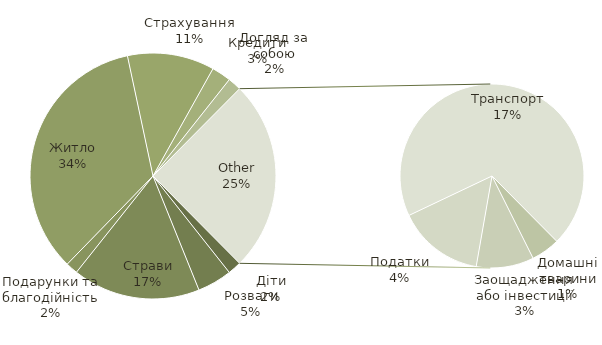
| Category | Підсумок |
|---|---|
| Діти | 140 |
| Розваги | 358 |
| Страви | 1320 |
| Подарунки та благодійність | 125 |
| Житло | 2702 |
| Страхування | 900 |
| Кредити | 200 |
| Догляд за собою | 140 |
| Домашні тварини | 100 |
| Заощадження або інвестиції | 200 |
| Податки | 300 |
| Транспорт | 1375 |